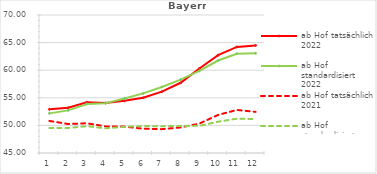
| Category | ab Hof tatsächlich 2022 | ab Hof standardisiert 2022 | ab Hof tatsächlich 2021 | ab Hof standardisiert 2021 |
|---|---|---|---|---|
| 0 | 52.915 | 52.179 | 50.814 | 49.518 |
| 1 | 53.198 | 52.723 | 50.256 | 49.536 |
| 2 | 54.196 | 53.889 | 50.388 | 49.855 |
| 3 | 54.057 | 54.025 | 49.82 | 49.471 |
| 4 | 54.453 | 54.867 | 49.781 | 49.733 |
| 5 | 55.005 | 55.799 | 49.406 | 49.886 |
| 6 | 56.113 | 56.959 | 49.32 | 49.849 |
| 7 | 57.722 | 58.284 | 49.633 | 49.905 |
| 8 | 60.302 | 59.878 | 50.33 | 49.917 |
| 9 | 62.734 | 61.757 | 51.901 | 50.67 |
| 10 | 64.216 | 62.986 | 52.797 | 51.216 |
| 11 | 64.488 | 63.059 | 52.458 | 51.149 |